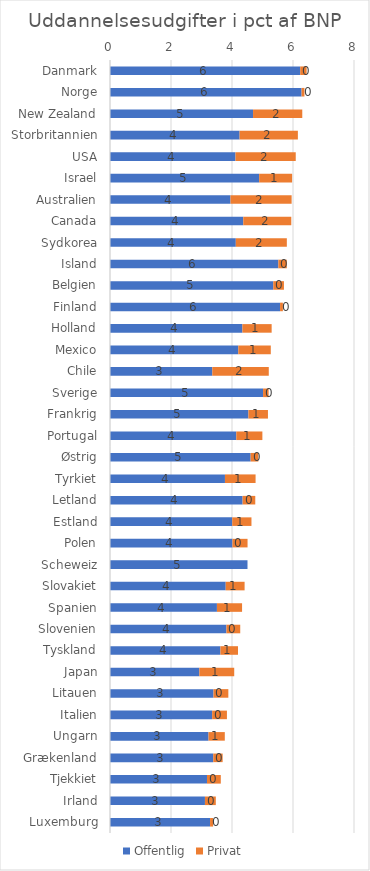
| Category | Offentlig | Privat |
|---|---|---|
| Danmark | 6.237 | 0.21 |
| Norge | 6.281 | 0.094 |
| New Zealand | 4.69 | 1.614 |
| Storbritannien | 4.249 | 1.911 |
| USA | 4.114 | 1.976 |
| Israel | 4.89 | 1.081 |
| Australien | 3.951 | 2.004 |
| Canada | 4.37 | 1.574 |
| Sydkorea | 4.125 | 1.673 |
| Island | 5.52 | 0.277 |
| Belgien | 5.353 | 0.35 |
| Finland | 5.576 | 0.092 |
| Holland | 4.341 | 0.959 |
| Mexico | 4.206 | 1.066 |
| Chile | 3.354 | 1.852 |
| Sverige | 5.018 | 0.183 |
| Frankrig | 4.538 | 0.641 |
| Portugal | 4.141 | 0.855 |
| Østrig | 4.611 | 0.252 |
| Tyrkiet | 3.769 | 1.004 |
| Letland | 4.348 | 0.415 |
| Estland | 4.008 | 0.63 |
| Polen | 4.015 | 0.495 |
| Scheweiz | 4.508 | 0 |
| Slovakiet | 3.794 | 0.619 |
| Spanien | 3.506 | 0.824 |
| Slovenien | 3.818 | 0.452 |
| Tyskland | 3.62 | 0.576 |
| Japan | 2.929 | 1.144 |
| Litauen | 3.393 | 0.487 |
| Italien | 3.349 | 0.485 |
| Ungarn | 3.23 | 0.534 |
| Grækenland | 3.385 | 0.308 |
| Tjekkiet | 3.18 | 0.453 |
| Irland | 3.113 | 0.356 |
| Luxemburg | 3.281 | 0.099 |